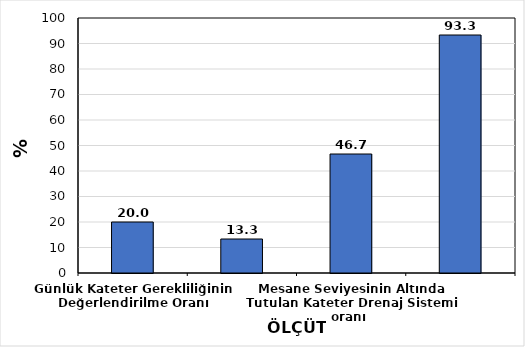
| Category | % |
|---|---|
| Günlük Kateter Gerekliliğinin Değerlendirilme Oranı | 20 |
| Üriner Kateter ve Toplayıcı Sistem Bütünlüğünün Korunma Oranı | 13.333 |
| Mesane Seviyesinin Altında Tutulan Kateter Drenaj Sistemi oranı  | 46.667 |
| Kateter Drenaj Sistemi Torbasının Zemin İle Temas Etmeme Oranı | 93.333 |